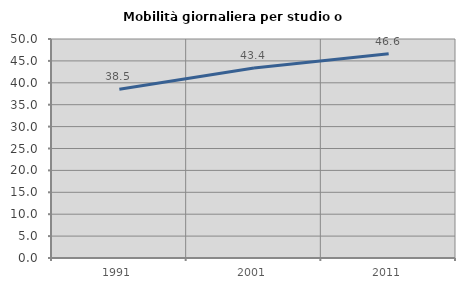
| Category | Mobilità giornaliera per studio o lavoro |
|---|---|
| 1991.0 | 38.511 |
| 2001.0 | 43.377 |
| 2011.0 | 46.629 |